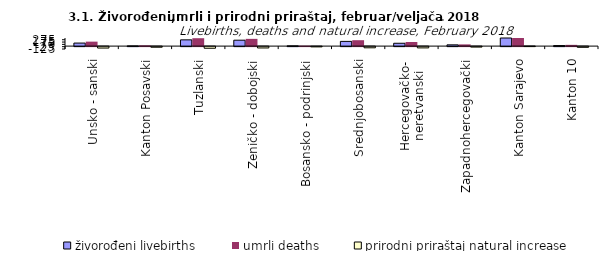
| Category | živorođeni livebirths | umrli deaths | prirodni priraštaj natural increase |
|---|---|---|---|
| Unsko - sanski | 131 | 193 | -62 |
| Kanton Posavski | 10 | 37 | -27 |
| Tuzlanski | 270 | 341 | -71 |
| Zeničko - dobojski | 255 | 313 | -58 |
| Bosansko - podrinjski | 12 | 23 | -11 |
| Srednjobosanski | 204 | 255 | -51 |
| Hercegovačko-
neretvanski | 123 | 178 | -55 |
| Zapadnohercegovački | 54 | 74 | -20 |
| Kanton Sarajevo | 370 | 365 | 5 |
| Kanton 10 | 23 | 54 | -31 |